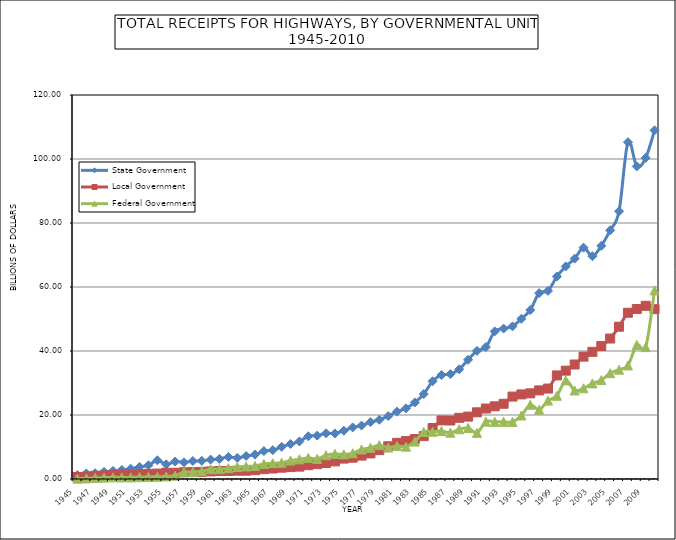
| Category | State Government | Local Government | Federal Government |
|---|---|---|---|
| 1945.0 | 1.212 | 0.624 | 0.093 |
| 1946.0 | 1.729 | 0.753 | 0.181 |
| 1947.0 | 1.788 | 1.014 | 0.339 |
| 1948.0 | 2.241 | 1.111 | 0.42 |
| 1949.0 | 2.516 | 1.247 | 0.515 |
| 1950.0 | 2.835 | 1.271 | 0.5 |
| 1951.0 | 3.212 | 1.327 | 0.499 |
| 1952.0 | 3.794 | 1.51 | 0.574 |
| 1953.0 | 4.292 | 1.607 | 0.66 |
| 1954.0 | 5.835 | 1.696 | 0.7 |
| 1955.0 | 4.587 | 1.967 | 0.791 |
| 1956.0 | 5.453 | 1.943 | 1.048 |
| 1957.0 | 5.215 | 2.096 | 2.145 |
| 1958.0 | 5.617 | 2.151 | 2.186 |
| 1959.0 | 5.676 | 2.222 | 2.428 |
| 1960.0 | 6.055 | 2.367 | 3.063 |
| 1961.0 | 6.281 | 2.487 | 3.083 |
| 1962.0 | 6.904 | 2.484 | 3.364 |
| 1963.0 | 6.576 | 2.596 | 3.733 |
| 1964.0 | 7.192 | 2.594 | 3.907 |
| 1965.0 | 7.623 | 2.736 | 4.079 |
| 1966.0 | 8.723 | 3.072 | 4.72 |
| 1967.0 | 9.004 | 3.288 | 4.921 |
| 1968.0 | 10.036 | 3.534 | 5.064 |
| 1969.0 | 10.941 | 3.713 | 5.772 |
| 1970.0 | 11.737 | 3.866 | 6.144 |
| 1971.0 | 13.359 | 4.317 | 6.584 |
| 1972.0 | 13.551 | 4.646 | 6.286 |
| 1973.0 | 14.288 | 4.996 | 7.419 |
| 1974.0 | 14.238 | 5.498 | 7.846 |
| 1975.0 | 15.105 | 6.379 | 7.676 |
| 1976.0 | 16.126 | 6.667 | 8.038 |
| 1977.0 | 16.7 | 7.313 | 9.23 |
| 1978.0 | 17.766 | 7.988 | 9.75 |
| 1979.0 | 18.507 | 9.018 | 10.56 |
| 1980.0 | 19.666 | 10.219 | 9.83 |
| 1981.0 | 21.044 | 11.311 | 10.338 |
| 1982.0 | 22.078 | 11.867 | 10.11 |
| 1983.0 | 23.918 | 12.471 | 11.684 |
| 1984.0 | 26.55 | 13.388 | 14.698 |
| 1985.0 | 30.543 | 15.933 | 14.749 |
| 1986.0 | 32.493 | 18.302 | 14.986 |
| 1987.0 | 32.788 | 18.28 | 14.466 |
| 1988.0 | 34.288 | 19.112 | 15.552 |
| 1989.0 | 37.274 | 19.501 | 15.946 |
| 1990.0 | 40.026 | 20.842 | 14.426 |
| 1991.0 | 41.217 | 22.021 | 17.922 |
| 1992.0 | 46.127 | 22.711 | 17.865 |
| 1993.0 | 47.008 | 23.509 | 17.863 |
| 1994.0 | 47.699 | 25.759 | 17.854 |
| 1995.0 | 50.064 | 26.432 | 19.851 |
| 1996.0 | 52.808 | 26.767 | 23.196 |
| 1997.0 | 58.087 | 27.686 | 21.648 |
| 1998.0 | 58.806 | 28.266 | 24.509 |
| 1999.0 | 63.274 | 32.368 | 26.008 |
| 2000.0 | 66.434 | 33.862 | 30.819 |
| 2001.0 | 68.873 | 35.781 | 27.67 |
| 2002.0 | 72.296 | 38.238 | 28.344 |
| 2003.0 | 69.633 | 39.735 | 29.878 |
| 2004.0 | 72.86 | 41.544 | 30.911 |
| 2005.0 | 77.725 | 43.895 | 33.07 |
| 2006.0 | 83.685 | 47.587 | 34.171 |
| 2007.0 | 105.268 | 51.956 | 35.49 |
| 2008.0 | 97.686 | 53.127 | 41.905 |
| 2009.0 | 100.353 | 54.122 | 41.205 |
| 2010.0 | 108.961 | 53.066 | 58.95 |